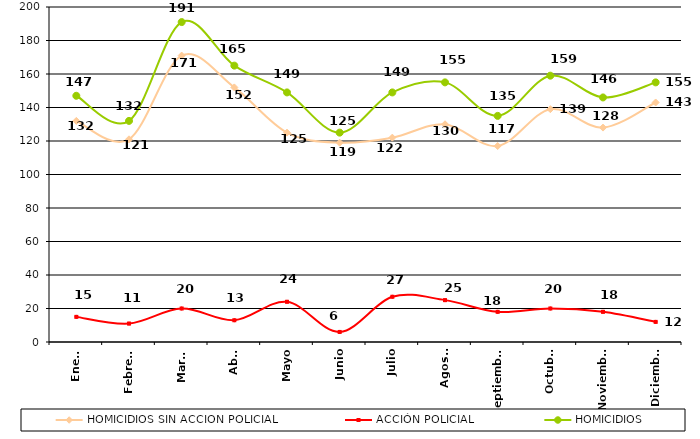
| Category | HOMICIDIOS SIN ACCION POLICIAL | ACCIÓN POLICIAL | HOMICIDIOS |
|---|---|---|---|
| Enero | 132 | 15 | 147 |
| Febrero | 121 | 11 | 132 |
| Marzo | 171 | 20 | 191 |
| Abril | 152 | 13 | 165 |
| Mayo | 125 | 24 | 149 |
| Junio | 119 | 6 | 125 |
| Julio | 122 | 27 | 149 |
| Agosto | 130 | 25 | 155 |
| Septiembre | 117 | 18 | 135 |
| Octubre | 139 | 20 | 159 |
| Noviembre | 128 | 18 | 146 |
| Diciembre | 143 | 12 | 155 |